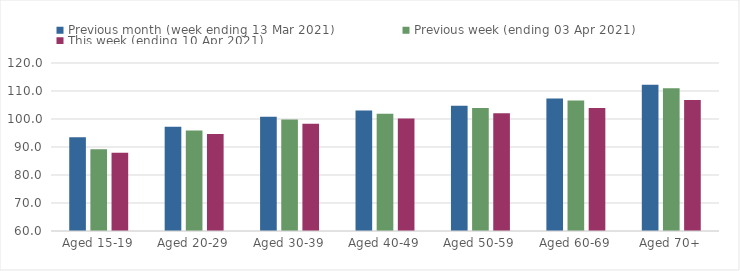
| Category | Previous month (week ending 13 Mar 2021) | Previous week (ending 03 Apr 2021) | This week (ending 10 Apr 2021) |
|---|---|---|---|
| Aged 15-19 | 93.46 | 89.21 | 87.98 |
| Aged 20-29 | 97.2 | 95.93 | 94.61 |
| Aged 30-39 | 100.83 | 99.83 | 98.29 |
| Aged 40-49 | 103.07 | 101.89 | 100.15 |
| Aged 50-59 | 104.77 | 103.89 | 102.04 |
| Aged 60-69 | 107.33 | 106.59 | 103.89 |
| Aged 70+ | 112.24 | 110.99 | 106.76 |